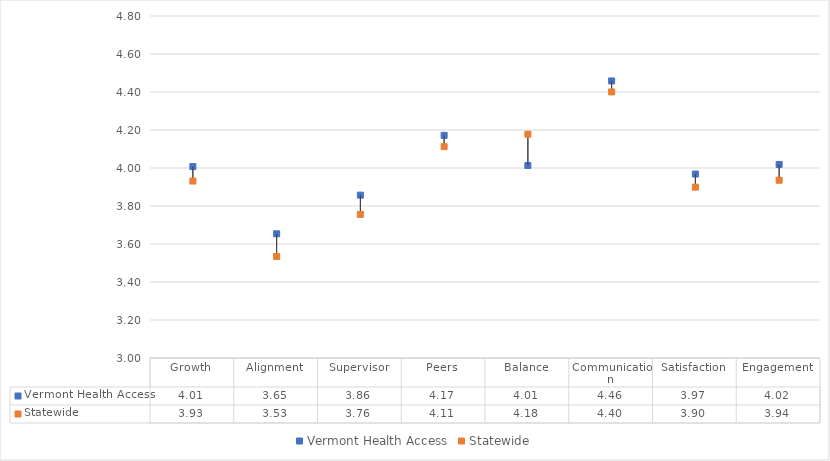
| Category | Vermont Health Access | Statewide |
|---|---|---|
| Growth | 4.007 | 3.931 |
| Alignment | 3.654 | 3.534 |
| Supervisor | 3.857 | 3.756 |
| Peers | 4.172 | 4.112 |
| Balance | 4.013 | 4.178 |
| Communication | 4.458 | 4.4 |
| Satisfaction | 3.968 | 3.899 |
| Engagement | 4.019 | 3.936 |